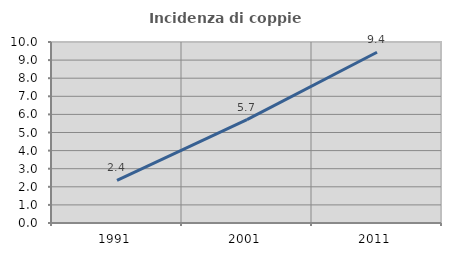
| Category | Incidenza di coppie miste |
|---|---|
| 1991.0 | 2.353 |
| 2001.0 | 5.714 |
| 2011.0 | 9.434 |